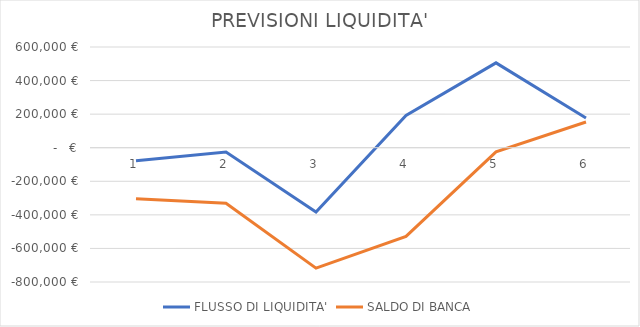
| Category | FLUSSO DI LIQUIDITA' | SALDO DI BANCA |
|---|---|---|
| 0 | -78040 | -304360.1 |
| 1 | -25500 | -331445.65 |
| 2 | -383500 | -717561.629 |
| 3 | 192000 | -528669.437 |
| 4 | 505500 | -24549.034 |
| 5 | 177500 | 152952.144 |